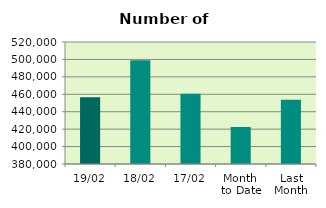
| Category | Series 0 |
|---|---|
| 19/02 | 456508 |
| 18/02 | 499186 |
| 17/02 | 460514 |
| Month 
to Date | 422436 |
| Last
Month | 453736.6 |